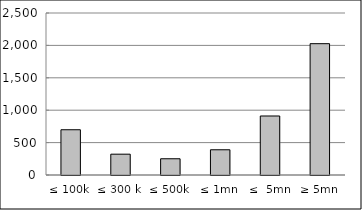
| Category | Series 0 |
|---|---|
| ≤ 100k | 698525121.902 |
| ≤ 300 k | 321383307.458 |
| ≤ 500k | 250723714.15 |
| ≤ 1mn | 389262687.29 |
| ≤  5mn | 910624614.72 |
| ≥ 5mn | 2026545819.425 |